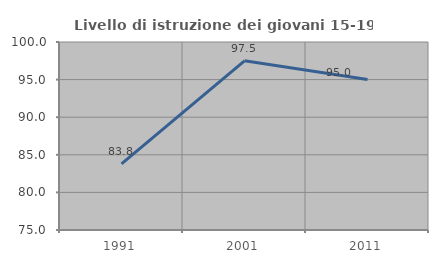
| Category | Livello di istruzione dei giovani 15-19 anni |
|---|---|
| 1991.0 | 83.784 |
| 2001.0 | 97.5 |
| 2011.0 | 95 |